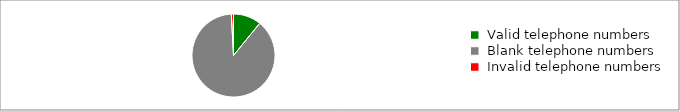
| Category | Series 0 |
|---|---|
|  Valid telephone numbers  | 8296 |
|  Blank telephone numbers  | 67379 |
|  Invalid telephone numbers  | 635 |